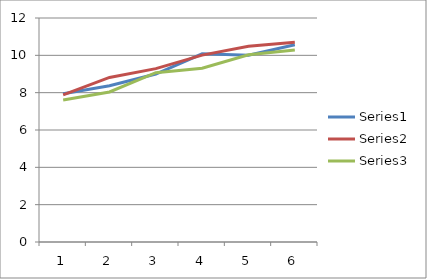
| Category | Series 0 | Series 1 | Series 2 |
|---|---|---|---|
| 0 | 7.941 | 7.886 | 7.607 |
| 1 | 8.37 | 8.814 | 8.036 |
| 2 | 9 | 9.286 | 9.072 |
| 3 | 10.085 | 10.013 | 9.307 |
| 4 | 10 | 10.485 | 10.027 |
| 5 | 10.566 | 10.702 | 10.288 |